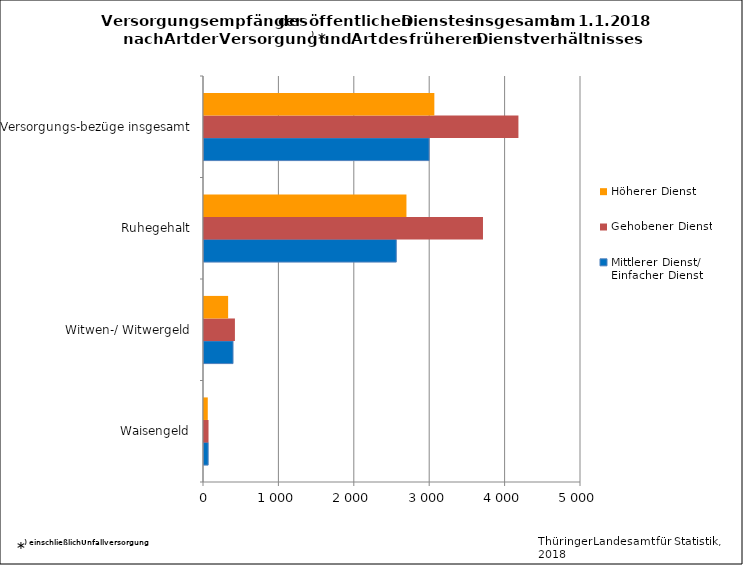
| Category | Mittlerer Dienst/ Einfacher Dienst | Gehobener Dienst | Höherer Dienst |
|---|---|---|---|
| Waisengeld | 55 | 60 | 50 |
| Witwen-/ Witwergeld | 385 | 410 | 320 |
| Ruhegehalt | 2550 | 3700 | 2685 |
| Versorgungs-bezüge insgesamt | 2985 | 4170 | 3055 |